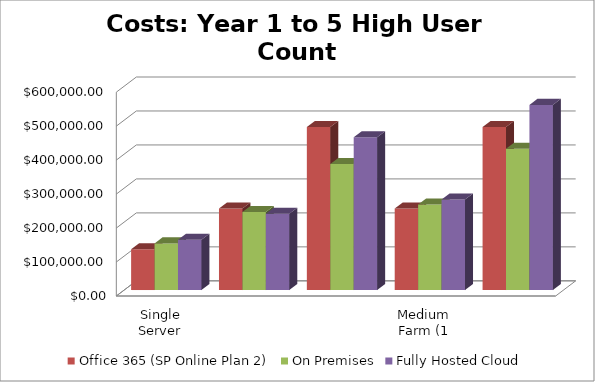
| Category | Office 365 (SP Online Plan 2) | On Premises | Fully Hosted Cloud |
|---|---|---|---|
| Single Server Install (WFE and SQL on 1 VM) | 120000 | 137322.828 | 147700 |
| Small Farm - Two Server Install (WFE and SQL) | 240000 | 229326.068 | 224600 |
| Small Farm w/ High Availability (2 WFE - 2 SQL) | 480000 | 370718.957 | 449500 |
| Medium Farm (1 WFE, 1 App/Index, 1 SQL) | 240000 | 251846.631 | 266600 |
| Medium Farm w/ High Availability (2 WFE, 2 A/I, 2 SQL) | 480000 | 415849.217 | 544900 |